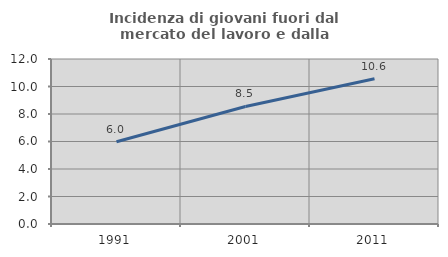
| Category | Incidenza di giovani fuori dal mercato del lavoro e dalla formazione  |
|---|---|
| 1991.0 | 5.985 |
| 2001.0 | 8.547 |
| 2011.0 | 10.561 |